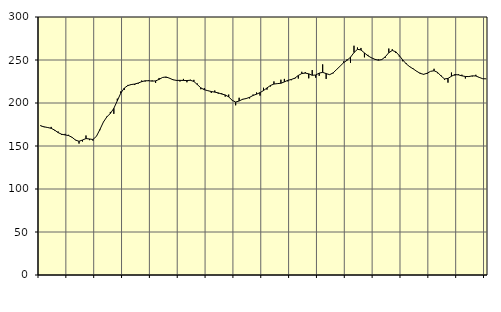
| Category | Piggar | Series 1 |
|---|---|---|
| nan | 174.1 | 173.34 |
| 87.0 | 171.9 | 172.28 |
| 87.0 | 171.8 | 171.48 |
| 87.0 | 172.2 | 170.55 |
| nan | 167.9 | 168.46 |
| 88.0 | 166.8 | 165.57 |
| 88.0 | 162.8 | 163.67 |
| 88.0 | 164.1 | 162.88 |
| nan | 163 | 162.13 |
| 89.0 | 159.8 | 160.11 |
| 89.0 | 157.2 | 156.85 |
| 89.0 | 152.8 | 155.47 |
| nan | 155.2 | 156.97 |
| 90.0 | 162.2 | 158.65 |
| 90.0 | 156.8 | 158.16 |
| 90.0 | 156.2 | 157.57 |
| nan | 161.4 | 161.25 |
| 91.0 | 168.4 | 169.17 |
| 91.0 | 178 | 177.82 |
| 91.0 | 184.4 | 183.87 |
| nan | 189.6 | 187.83 |
| 92.0 | 187.4 | 193.79 |
| 92.0 | 205 | 202.62 |
| 92.0 | 213.5 | 211.45 |
| nan | 215.2 | 217.35 |
| 93.0 | 221 | 220.23 |
| 93.0 | 222 | 221.47 |
| 93.0 | 220.9 | 222.05 |
| nan | 222.5 | 223.21 |
| 94.0 | 226.1 | 224.79 |
| 94.0 | 225 | 225.85 |
| 94.0 | 226.5 | 225.86 |
| nan | 226.3 | 225.44 |
| 95.0 | 223.4 | 225.72 |
| 95.0 | 229.1 | 227.46 |
| 95.0 | 229.5 | 229.7 |
| nan | 229.3 | 230.26 |
| 96.0 | 228.6 | 228.83 |
| 96.0 | 226.8 | 227 |
| 96.0 | 225.8 | 226.27 |
| nan | 225 | 226.34 |
| 97.0 | 228 | 226.21 |
| 97.0 | 224.1 | 226.14 |
| 97.0 | 227 | 226.4 |
| nan | 226.9 | 225.05 |
| 98.0 | 222.6 | 221.4 |
| 98.0 | 216 | 217.59 |
| 98.0 | 217.2 | 215.44 |
| nan | 214.5 | 214.3 |
| 99.0 | 211.7 | 213.34 |
| 99.0 | 214.5 | 212.63 |
| 99.0 | 210.8 | 211.78 |
| nan | 211.3 | 210.42 |
| 0.0 | 207.4 | 209.39 |
| 0.0 | 209.8 | 207.12 |
| 0.0 | 203.3 | 203.12 |
| nan | 197.3 | 201.14 |
| 1.0 | 206.1 | 202.31 |
| 1.0 | 203.8 | 204.35 |
| 1.0 | 205 | 205.15 |
| nan | 205.3 | 206.59 |
| 2.0 | 209.8 | 208.77 |
| 2.0 | 212.2 | 210.23 |
| 2.0 | 208.6 | 212.05 |
| nan | 217.7 | 214.48 |
| 3.0 | 215.5 | 217.5 |
| 3.0 | 219.2 | 220.37 |
| 3.0 | 225.1 | 222.04 |
| nan | 222.8 | 222.53 |
| 4.0 | 227.1 | 222.96 |
| 4.0 | 228 | 224.56 |
| 4.0 | 225.1 | 226.4 |
| nan | 226.5 | 227.35 |
| 5.0 | 228.2 | 228.9 |
| 5.0 | 228.4 | 232.01 |
| 5.0 | 236.3 | 234.28 |
| nan | 235.9 | 234.79 |
| 6.0 | 228.7 | 233.89 |
| 6.0 | 238.3 | 232.22 |
| 6.0 | 229.4 | 232.56 |
| nan | 231.6 | 234.74 |
| 7.0 | 244.9 | 235.63 |
| 7.0 | 228 | 234.21 |
| 7.0 | 233.1 | 232.95 |
| nan | 234.5 | 235 |
| 8.0 | 238.6 | 238.92 |
| 8.0 | 242.8 | 242.79 |
| 8.0 | 248.3 | 246.81 |
| nan | 250.8 | 249.69 |
| 9.0 | 246.7 | 253.22 |
| 9.0 | 266.6 | 258.64 |
| 9.0 | 264.5 | 262.42 |
| nan | 264 | 261.71 |
| 10.0 | 253.1 | 258.23 |
| 10.0 | 256 | 254.9 |
| 10.0 | 252.3 | 252.6 |
| nan | 251.1 | 250.81 |
| 11.0 | 250.7 | 249.76 |
| 11.0 | 250.2 | 250.51 |
| 11.0 | 252.7 | 253.79 |
| nan | 263.3 | 258.49 |
| 12.0 | 262.5 | 261.11 |
| 12.0 | 258.2 | 259.54 |
| 12.0 | 254.2 | 255.16 |
| nan | 248.5 | 250.11 |
| 13.0 | 246.2 | 245.5 |
| 13.0 | 242.7 | 242.22 |
| 13.0 | 240.1 | 239.69 |
| nan | 237.2 | 236.96 |
| 14.0 | 235.1 | 234.45 |
| 14.0 | 233.7 | 233.34 |
| 14.0 | 233.7 | 234.59 |
| nan | 236.8 | 236.8 |
| 15.0 | 239.8 | 237.51 |
| 15.0 | 234.6 | 235.68 |
| 15.0 | 232.1 | 231.45 |
| nan | 227 | 228 |
| 16.0 | 223.7 | 228.53 |
| 16.0 | 235.4 | 231.14 |
| 16.0 | 231.9 | 233.07 |
| nan | 233.5 | 232.69 |
| 17.0 | 232.9 | 231.6 |
| 17.0 | 228.5 | 230.85 |
| 17.0 | 231.1 | 230.75 |
| nan | 230.9 | 231.57 |
| 18.0 | 232.8 | 231.42 |
| 18.0 | 230.2 | 229.75 |
| 18.0 | 228.3 | 228.21 |
| nan | 228.1 | 228.11 |